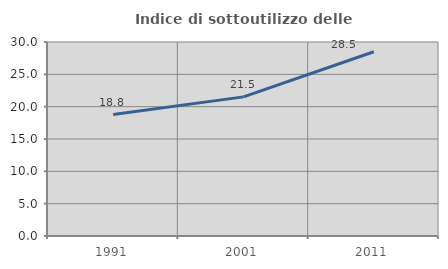
| Category | Indice di sottoutilizzo delle abitazioni  |
|---|---|
| 1991.0 | 18.779 |
| 2001.0 | 21.516 |
| 2011.0 | 28.497 |